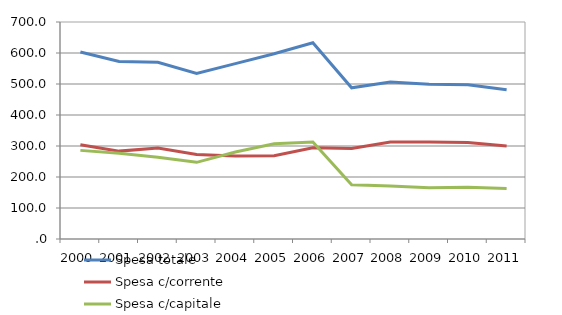
| Category | Spesa totale | Spesa c/corrente | Spesa c/capitale |
|---|---|---|---|
| 2000 | 603.41 | 304.006 | 285.888 |
| 2001 | 572.363 | 283.49 | 276.365 |
| 2002 | 570.371 | 293.476 | 263.901 |
| 2003 | 533.942 | 272.63 | 247.324 |
| 2004 | 565.622 | 267.789 | 280.427 |
| 2005 | 597.68 | 268.659 | 306.977 |
| 2006 | 632.88 | 294.125 | 312.798 |
| 2007 | 487.728 | 291.867 | 174.694 |
| 2008 | 506.27 | 313.031 | 170.802 |
| 2009 | 499.168 | 312.656 | 165.393 |
| 2010 | 497.825 | 311.241 | 166.592 |
| 2011 | 481.48 | 300.18 | 163.265 |